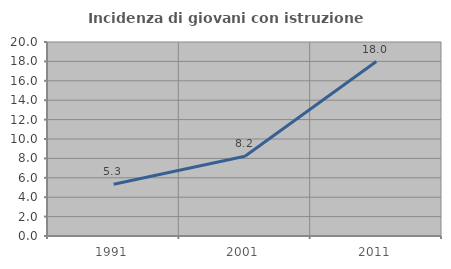
| Category | Incidenza di giovani con istruzione universitaria |
|---|---|
| 1991.0 | 5.341 |
| 2001.0 | 8.219 |
| 2011.0 | 17.984 |